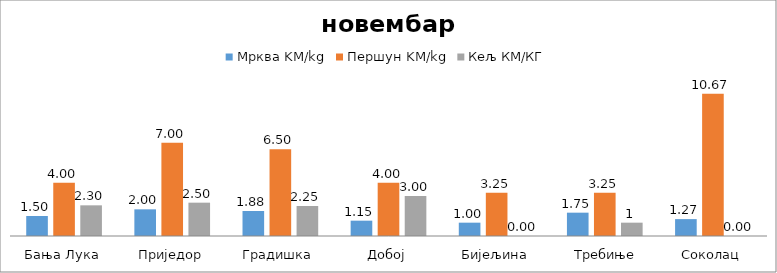
| Category | Мрква KM/kg | Першун KM/kg | Кељ КМ/КГ |
|---|---|---|---|
| Бања Лука | 1.5 | 4 | 2.3 |
| Приједор | 2 | 7 | 2.5 |
| Градишка | 1.875 | 6.5 | 2.25 |
| Добој | 1.15 | 4 | 3 |
| Бијељина | 1 | 3.25 | 0 |
|  Требиње | 1.75 | 3.25 | 1 |
| Соколац | 1.267 | 10.667 | 0 |